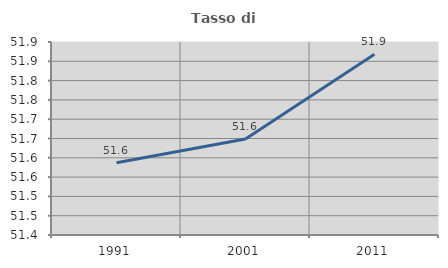
| Category | Tasso di occupazione   |
|---|---|
| 1991.0 | 51.587 |
| 2001.0 | 51.649 |
| 2011.0 | 51.868 |